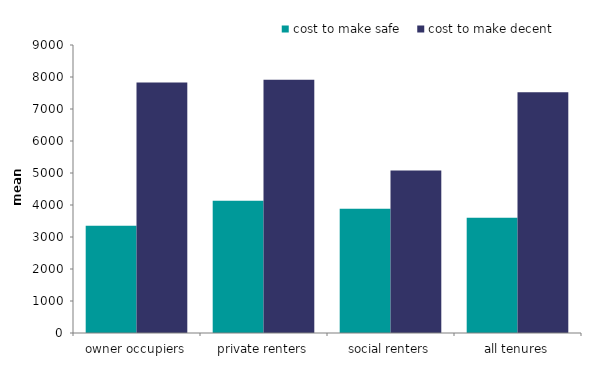
| Category | cost to make safe | cost to make decent |
|---|---|---|
| owner occupiers | 3354.449 | 7832.011 |
| private renters | 4133.322 | 7912.08 |
| social renters | 3882.707 | 5077.477 |
| all tenures | 3598.446 | 7520.725 |